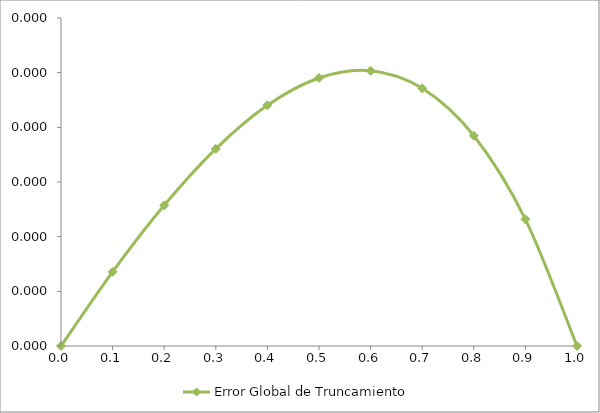
| Category | Error Global de Truncamiento |
|---|---|
| 0.0 | 0 |
| 0.1 | 0 |
| 0.2 | 0 |
| 0.3 | 0 |
| 0.4 | 0 |
| 0.5 | 0 |
| 0.6 | 0 |
| 0.7 | 0 |
| 0.8 | 0 |
| 0.9 | 0 |
| 1.0 | 0 |